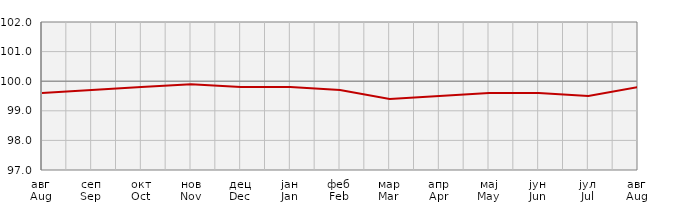
| Category | Индекси цијена произвођача
Producer price indices | Series 1 |
|---|---|---|
| авг
Aug | 99.6 |  |
| сеп
Sep | 99.7 |  |
| окт
Oct | 99.8 |  |
| нов
Nov | 99.9 |  |
| дец
Dec | 99.8 |  |
| јан
Jan | 99.8 |  |
| феб
Feb | 99.7 |  |
| мар
Mar | 99.4 |  |
| апр
Apr | 99.5 |  |
| мај
May | 99.6 |  |
| јун
Jun | 99.6 |  |
| јул
Jul | 99.5 |  |
| авг
Aug | 99.8 |  |